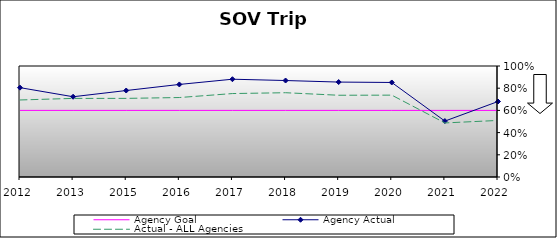
| Category | Agency Goal | Agency Actual | Actual - ALL Agencies |
|---|---|---|---|
| 2012.0 | 0.6 | 0.805 | 0.694 |
| 2013.0 | 0.6 | 0.723 | 0.708 |
| 2015.0 | 0.6 | 0.779 | 0.708 |
| 2016.0 | 0.6 | 0.834 | 0.716 |
| 2017.0 | 0.6 | 0.881 | 0.752 |
| 2018.0 | 0.6 | 0.869 | 0.759 |
| 2019.0 | 0.6 | 0.855 | 0.736 |
| 2020.0 | 0.6 | 0.852 | 0.737 |
| 2021.0 | 0.6 | 0.504 | 0.487 |
| 2022.0 | 0.6 | 0.68 | 0.509 |